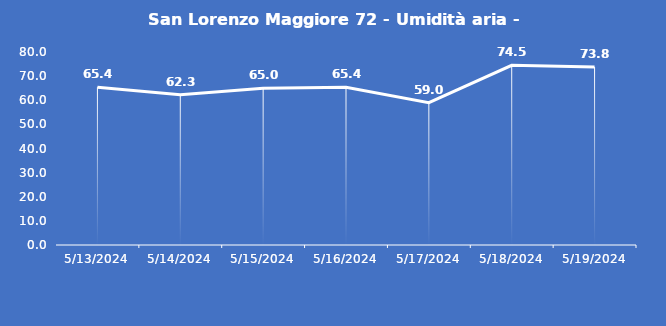
| Category | San Lorenzo Maggiore 72 - Umidità aria - Grezzo (%) |
|---|---|
| 5/13/24 | 65.4 |
| 5/14/24 | 62.3 |
| 5/15/24 | 65 |
| 5/16/24 | 65.4 |
| 5/17/24 | 59 |
| 5/18/24 | 74.5 |
| 5/19/24 | 73.8 |